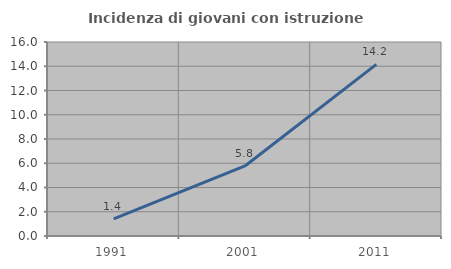
| Category | Incidenza di giovani con istruzione universitaria |
|---|---|
| 1991.0 | 1.413 |
| 2001.0 | 5.775 |
| 2011.0 | 14.151 |